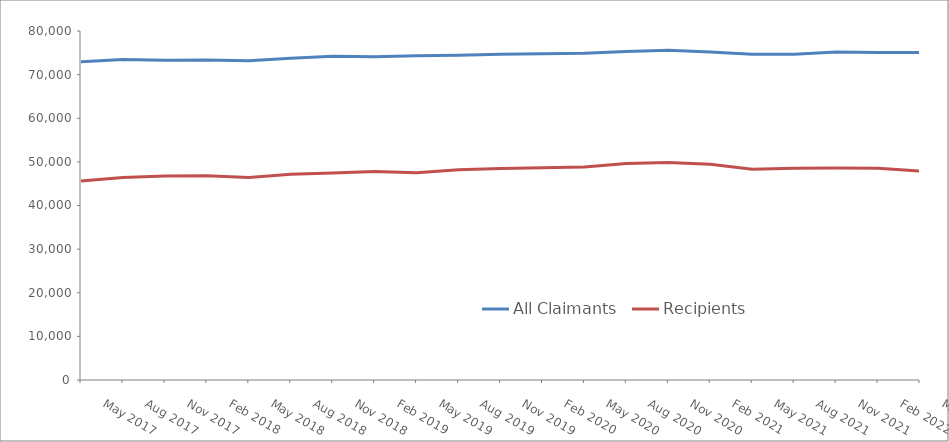
| Category | All Claimants | Recipients |
|---|---|---|
| May 2017 | 72970 | 45610 |
| Aug 2017 | 73450 | 46400 |
| Nov 2017 | 73280 | 46770 |
| Feb 2018 | 73350 | 46820 |
| May 2018 | 73200 | 46430 |
| Aug 2018 | 73730 | 47150 |
| Nov 2018 | 74210 | 47450 |
| Feb 2019 | 74070 | 47810 |
| May 2019 | 74340 | 47510 |
| Aug 2019 | 74420 | 48170 |
| Nov 2019 | 74690 | 48500 |
| Feb 2020 | 74800 | 48650 |
| May 2020 | 74910 | 48810 |
| Aug 2020 | 75280 | 49650 |
| Nov 2020 | 75610 | 49870 |
| Feb 2021 | 75210 | 49460 |
| May 2021 | 74690 | 48300 |
| Aug 2021 | 74690 | 48520 |
| Nov 2021 | 75170 | 48600 |
| Feb 2022 | 75050 | 48540 |
| May 2022 | 75060 | 47910 |